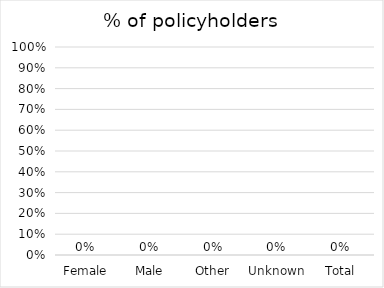
| Category | % of policyholders |
|---|---|
| Female | 0 |
| Male | 0 |
| Other | 0 |
| Unknown | 0 |
| Total | 0 |